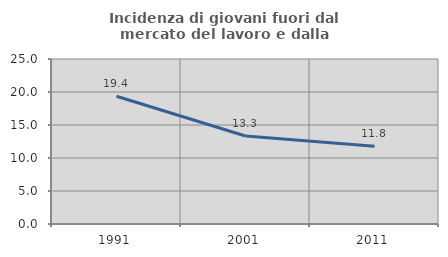
| Category | Incidenza di giovani fuori dal mercato del lavoro e dalla formazione  |
|---|---|
| 1991.0 | 19.355 |
| 2001.0 | 13.333 |
| 2011.0 | 11.765 |